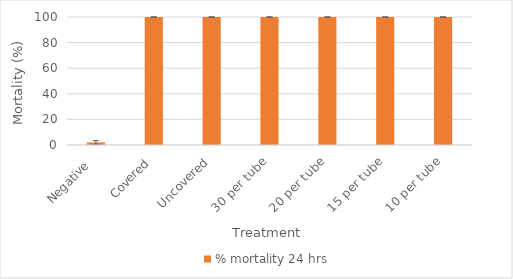
| Category | % mortality 24 hrs |
|---|---|
| Negative  | 2 |
| Covered | 100 |
| Uncovered | 100 |
| 30 per tube | 100 |
| 20 per tube | 100 |
| 15 per tube | 100 |
| 10 per tube | 100 |